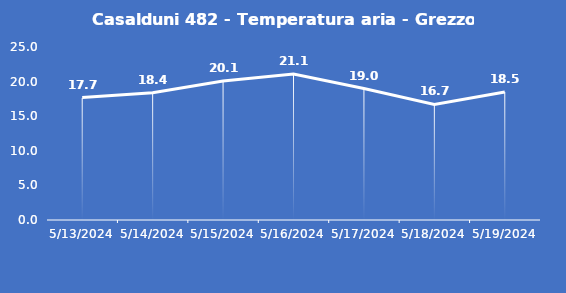
| Category | Casalduni 482 - Temperatura aria - Grezzo (°C) |
|---|---|
| 5/13/24 | 17.7 |
| 5/14/24 | 18.4 |
| 5/15/24 | 20.1 |
| 5/16/24 | 21.1 |
| 5/17/24 | 19 |
| 5/18/24 | 16.7 |
| 5/19/24 | 18.5 |